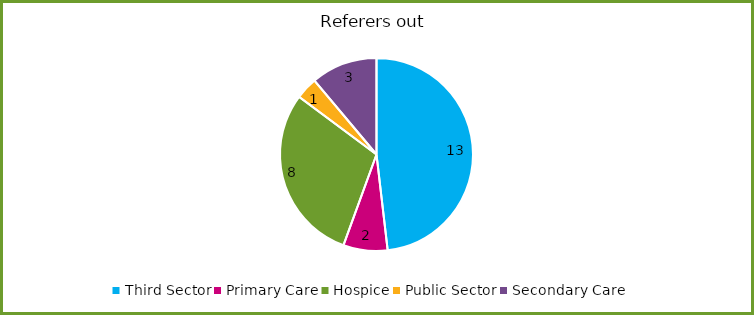
| Category | Series 0 |
|---|---|
| Third Sector | 13 |
| Primary Care | 2 |
| Hospice | 8 |
| Public Sector | 1 |
| Secondary Care | 3 |